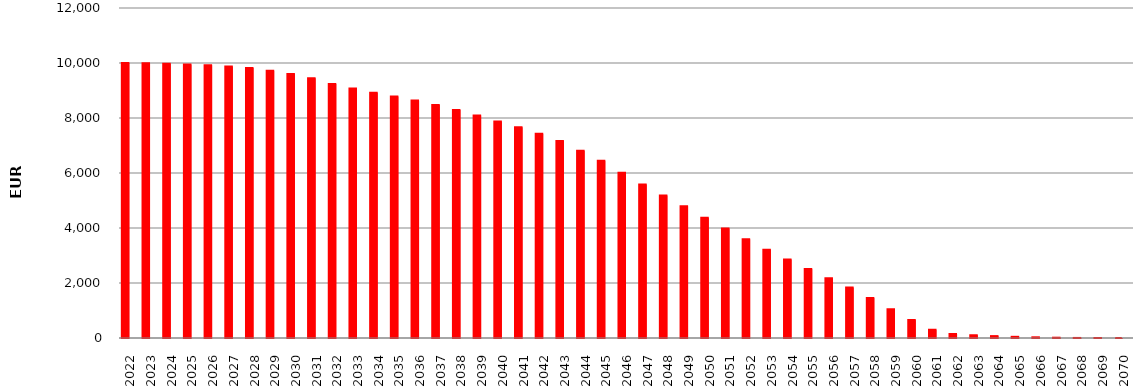
| Category | 10006067777 | SumOfMont Cred Ced act |
|---|---|---|
| 2022 | 10003041911.76 | 3025865.18 |
| 2023 | 9991103591.07 | 11938320.69 |
| 2024 | 9970669167.85 | 20434423.22 |
| 2025 | 9946160980.23 | 24508187.62 |
| 2026 | 9914678307.05 | 31482673.18 |
| 2027 | 9870266088.61 | 44412218.44 |
| 2028 | 9814301757.82 | 55964330.79 |
| 2029 | 9722423091.46 | 91878666.36 |
| 2030 | 9601563189.75 | 120859901.71 |
| 2031 | 9447734396.37 | 153828793.38 |
| 2032 | 9238624625.9 | 209109770.47 |
| 2033 | 9070976605.55 | 167648020.35 |
| 2034 | 8916437455.64 | 154539149.91 |
| 2035 | 8782967815.11 | 133469640.53 |
| 2036 | 8639980479.96 | 142987335.15 |
| 2037 | 8468290887.77 | 171689592.19 |
| 2038 | 8292339404.35 | 175951483.42 |
| 2039 | 8094786679.12 | 197552725.23 |
| 2040 | 7875079431.28 | 219707247.84 |
| 2041 | 7661267253.15 | 213812178.13 |
| 2042 | 7431532696.49 | 229734556.66 |
| 2043 | 7164369807.62 | 267162888.87 |
| 2044 | 6812581516.9 | 351788290.72 |
| 2045 | 6441835682.12 | 370745834.78 |
| 2046 | 6008494788.34 | 433340893.78 |
| 2047 | 5583171369.89 | 425323418.45 |
| 2048 | 5186339546.86 | 396831823.03 |
| 2049 | 4788426059.55 | 397913487.31 |
| 2050 | 4369315444.59 | 419110614.96 |
| 2051 | 3979949461.12 | 389365983.47 |
| 2052 | 3589931080.03 | 390018381.09 |
| 2053 | 3212556043.87 | 377375036.16 |
| 2054 | 2856998381.4 | 355557662.47 |
| 2055 | 2507982923.53 | 349015457.87 |
| 2056 | 2168941882.36 | 339041041.17 |
| 2057 | 1834494263.85 | 334447618.51 |
| 2058 | 1452612105.48 | 381882158.37 |
| 2059 | 1049902184.31 | 402709921.17 |
| 2060 | 651819406.04 | 398082778.27 |
| 2061 | 299395452.17 | 352423953.87 |
| 2062 | 149198057.03 | 150197395.14 |
| 2063 | 100565796.03 | 48632261 |
| 2064 | 68604478.75 | 31961317.28 |
| 2065 | 43004958 | 25599520.75 |
| 2066 | 25124098.01 | 17880859.99 |
| 2067 | 11176376.56 | 13947721.45 |
| 2068 | 2131752.34 | 9044624.22 |
| 2069 | 355956.37 | 1775795.97 |
| 2070 | 0 | 355956.37 |